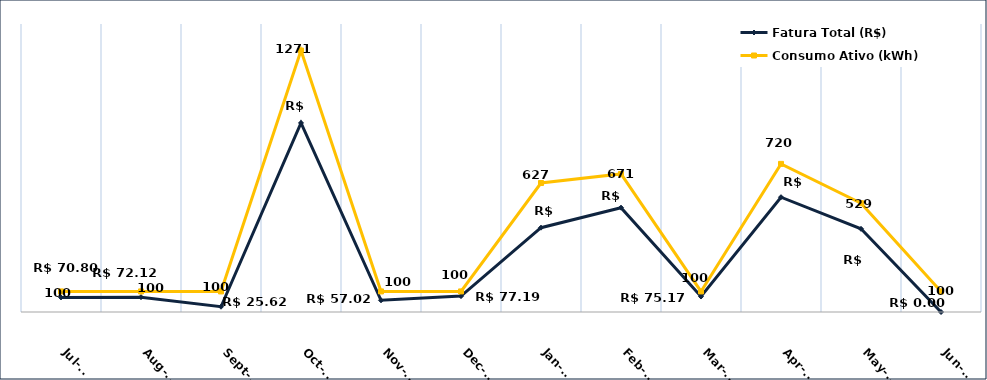
| Category | Fatura Total (R$) |
|---|---|
| 2023-07-01 | 70.8 |
| 2023-08-01 | 72.12 |
| 2023-09-01 | 25.62 |
| 2023-10-01 | 918.93 |
| 2023-11-01 | 57.02 |
| 2023-12-01 | 77.19 |
| 2024-01-01 | 409.93 |
| 2024-02-01 | 507.16 |
| 2024-03-01 | 75.17 |
| 2024-04-01 | 558.07 |
| 2024-05-01 | 404.33 |
| 2024-06-01 | 0 |